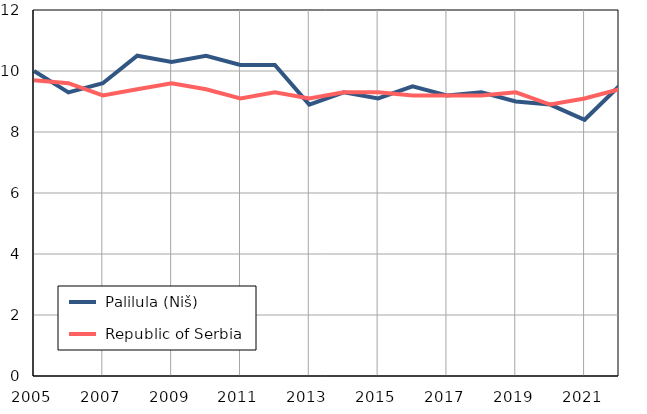
| Category |  Palilula (Niš) |  Republic of Serbia |
|---|---|---|
| 2005.0 | 10 | 9.7 |
| 2006.0 | 9.3 | 9.6 |
| 2007.0 | 9.6 | 9.2 |
| 2008.0 | 10.5 | 9.4 |
| 2009.0 | 10.3 | 9.6 |
| 2010.0 | 10.5 | 9.4 |
| 2011.0 | 10.2 | 9.1 |
| 2012.0 | 10.2 | 9.3 |
| 2013.0 | 8.9 | 9.1 |
| 2014.0 | 9.3 | 9.3 |
| 2015.0 | 9.1 | 9.3 |
| 2016.0 | 9.5 | 9.2 |
| 2017.0 | 9.2 | 9.2 |
| 2018.0 | 9.3 | 9.2 |
| 2019.0 | 9 | 9.3 |
| 2020.0 | 8.9 | 8.9 |
| 2021.0 | 8.4 | 9.1 |
| 2022.0 | 9.5 | 9.4 |